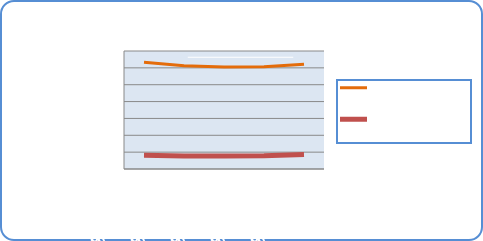
| Category | Motorin Türleri  | Benzin Türleri |
|---|---|---|
| 9/24/18 | 63363144.283 | 8164772.434 |
| 9/25/18 | 61190495.912 | 7743592.657 |
| 9/26/18 | 60501930.918 | 7775956.622 |
| 9/27/18 | 60615641.832 | 7883965.187 |
| 9/28/18 | 62139501.404 | 8639005.262 |